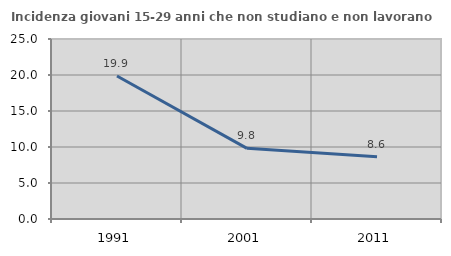
| Category | Incidenza giovani 15-29 anni che non studiano e non lavorano  |
|---|---|
| 1991.0 | 19.857 |
| 2001.0 | 9.817 |
| 2011.0 | 8.638 |